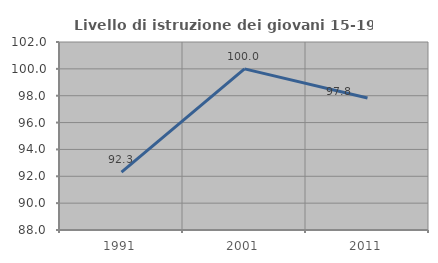
| Category | Livello di istruzione dei giovani 15-19 anni |
|---|---|
| 1991.0 | 92.308 |
| 2001.0 | 100 |
| 2011.0 | 97.826 |